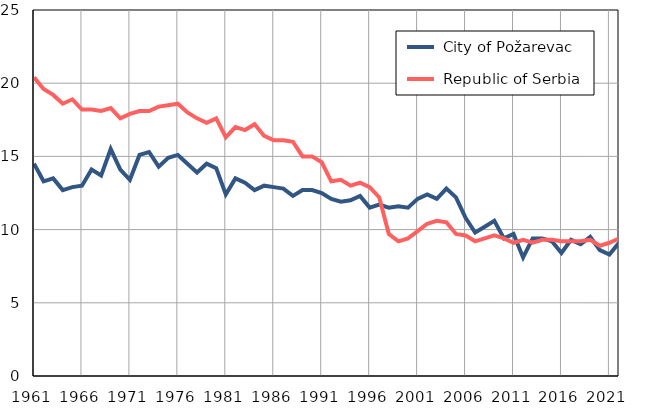
| Category |  City of Požarevac |  Republic of Serbia |
|---|---|---|
| 1961.0 | 14.5 | 20.4 |
| 1962.0 | 13.3 | 19.6 |
| 1963.0 | 13.5 | 19.2 |
| 1964.0 | 12.7 | 18.6 |
| 1965.0 | 12.9 | 18.9 |
| 1966.0 | 13 | 18.2 |
| 1967.0 | 14.1 | 18.2 |
| 1968.0 | 13.7 | 18.1 |
| 1969.0 | 15.5 | 18.3 |
| 1970.0 | 14.1 | 17.6 |
| 1971.0 | 13.4 | 17.9 |
| 1972.0 | 15.1 | 18.1 |
| 1973.0 | 15.3 | 18.1 |
| 1974.0 | 14.3 | 18.4 |
| 1975.0 | 14.9 | 18.5 |
| 1976.0 | 15.1 | 18.6 |
| 1977.0 | 14.5 | 18 |
| 1978.0 | 13.9 | 17.6 |
| 1979.0 | 14.5 | 17.3 |
| 1980.0 | 14.2 | 17.6 |
| 1981.0 | 12.4 | 16.3 |
| 1982.0 | 13.5 | 17 |
| 1983.0 | 13.2 | 16.8 |
| 1984.0 | 12.7 | 17.2 |
| 1985.0 | 13 | 16.4 |
| 1986.0 | 12.9 | 16.1 |
| 1987.0 | 12.8 | 16.1 |
| 1988.0 | 12.3 | 16 |
| 1989.0 | 12.7 | 15 |
| 1990.0 | 12.7 | 15 |
| 1991.0 | 12.5 | 14.6 |
| 1992.0 | 12.1 | 13.3 |
| 1993.0 | 11.9 | 13.4 |
| 1994.0 | 12 | 13 |
| 1995.0 | 12.3 | 13.2 |
| 1996.0 | 11.5 | 12.9 |
| 1997.0 | 11.7 | 12.2 |
| 1998.0 | 11.5 | 9.7 |
| 1999.0 | 11.6 | 9.2 |
| 2000.0 | 11.5 | 9.4 |
| 2001.0 | 12.1 | 9.9 |
| 2002.0 | 12.4 | 10.4 |
| 2003.0 | 12.1 | 10.6 |
| 2004.0 | 12.8 | 10.5 |
| 2005.0 | 12.2 | 9.7 |
| 2006.0 | 10.8 | 9.6 |
| 2007.0 | 9.8 | 9.2 |
| 2008.0 | 10.2 | 9.4 |
| 2009.0 | 10.6 | 9.6 |
| 2010.0 | 9.4 | 9.4 |
| 2011.0 | 9.7 | 9.1 |
| 2012.0 | 8.1 | 9.3 |
| 2013.0 | 9.4 | 9.1 |
| 2014.0 | 9.4 | 9.3 |
| 2015.0 | 9.2 | 9.3 |
| 2016.0 | 8.4 | 9.2 |
| 2017.0 | 9.3 | 9.2 |
| 2018.0 | 9 | 9.2 |
| 2019.0 | 9.5 | 9.3 |
| 2020.0 | 8.6 | 8.9 |
| 2021.0 | 8.3 | 9.1 |
| 2022.0 | 9.1 | 9.4 |